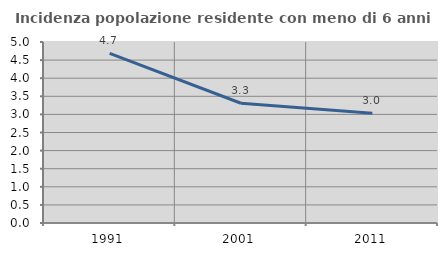
| Category | Incidenza popolazione residente con meno di 6 anni |
|---|---|
| 1991.0 | 4.684 |
| 2001.0 | 3.309 |
| 2011.0 | 3.03 |